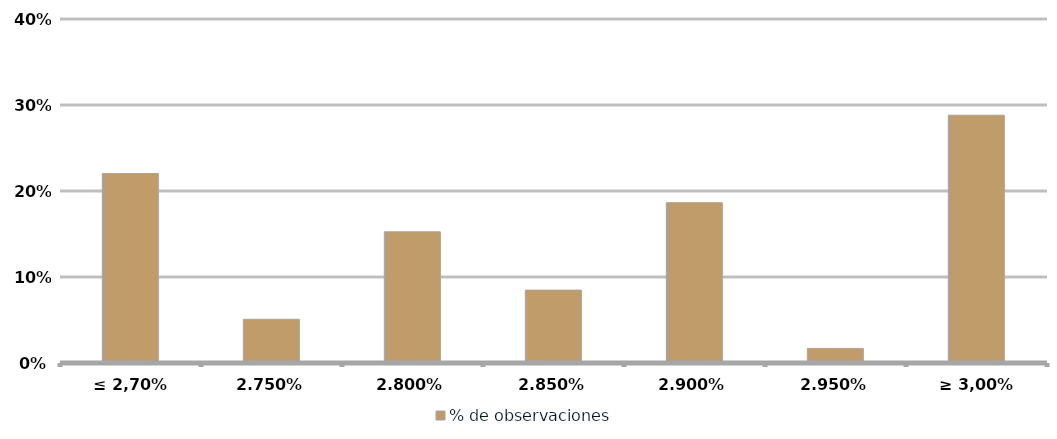
| Category | % de observaciones  |
|---|---|
| ≤ 2,70% | 0.22 |
| 2.75% | 0.051 |
| 2.80% | 0.153 |
| 2.85% | 0.085 |
| 2.90% | 0.186 |
| 2.95% | 0.017 |
| ≥ 3,00% | 0.288 |